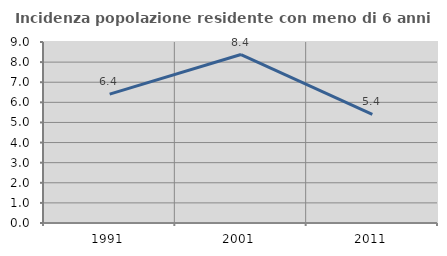
| Category | Incidenza popolazione residente con meno di 6 anni |
|---|---|
| 1991.0 | 6.405 |
| 2001.0 | 8.377 |
| 2011.0 | 5.403 |